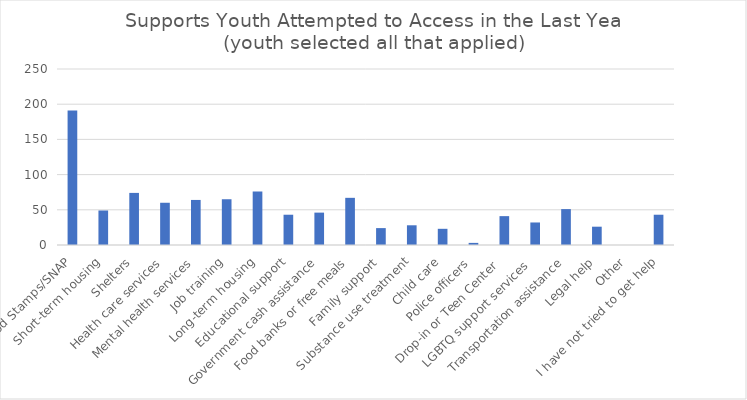
| Category | Series 0 |
|---|---|
| Food Stamps/SNAP | 191 |
| Short-term housing | 49 |
| Shelters | 74 |
| Health care services | 60 |
| Mental health services | 64 |
| Job training | 65 |
| Long-term housing | 76 |
| Educational support | 43 |
| Government cash assistance | 46 |
| Food banks or free meals | 67 |
| Family support | 24 |
| Substance use treatment | 28 |
| Child care | 23 |
| Police officers | 3 |
| Drop-in or Teen Center  | 41 |
| LGBTQ support services  | 32 |
| Transportation assistance | 51 |
| Legal help | 26 |
| Other | 0 |
| I have not tried to get help | 43 |